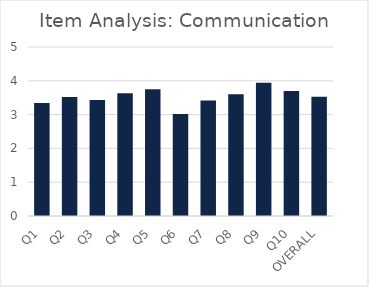
| Category | Series 0 |
|---|---|
| Q1 | 3.34 |
| Q2 | 3.52 |
| Q3 | 3.43 |
| Q4 | 3.63 |
| Q5 | 3.75 |
| Q6 | 3.02 |
| Q7 | 3.42 |
| Q8 | 3.6 |
| Q9 | 3.94 |
| Q10 | 3.7 |
| OVERALL | 3.53 |